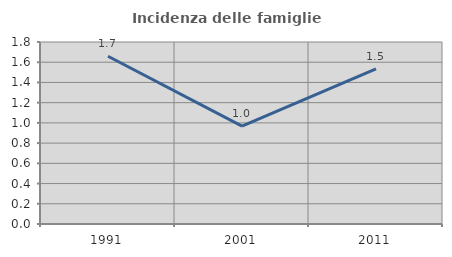
| Category | Incidenza delle famiglie numerose |
|---|---|
| 1991.0 | 1.659 |
| 2001.0 | 0.967 |
| 2011.0 | 1.535 |